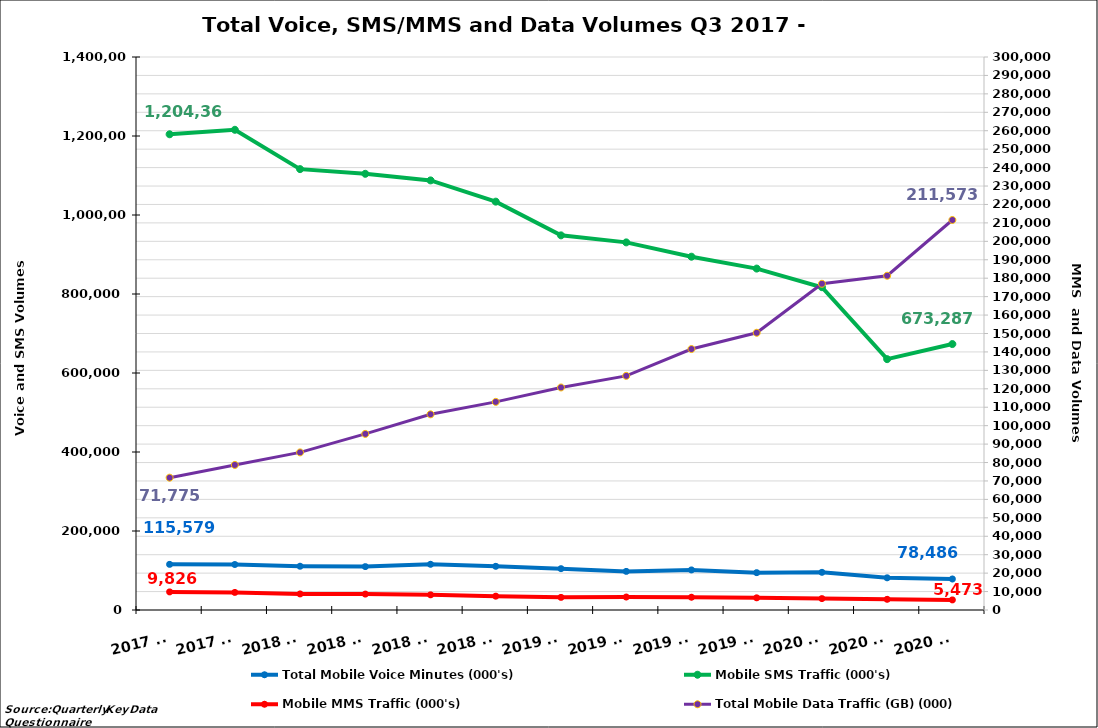
| Category | Total Mobile Voice Minutes (000's) | Mobile SMS Traffic (000's) |
|---|---|---|
| 2017 Q3 | 115579.059 | 1204368.619 |
| 2017 Q4 | 115214.312 | 1215724.329 |
| 2018 Q1 | 110806.011 | 1116125.96 |
| 2018 Q2 | 109832.006 | 1104263.271 |
| 2018 Q3 | 115680.856 | 1087595.075 |
| 2018 Q4 | 110600.636 | 1033800.637 |
| 2019 Q1 | 104666.386 | 948453.641 |
| 2019 Q2 | 97784.803 | 930671.841 |
| 2019 Q3 | 101431.447 | 894408.206 |
| 2019 Q4 | 94528.618 | 864343.063 |
| 2020 Q1 | 95362.079 | 817190.979 |
| 2020 Q2 | 81537.186 | 635067.581 |
| 2020 Q3 | 78486.177 | 673286.691 |